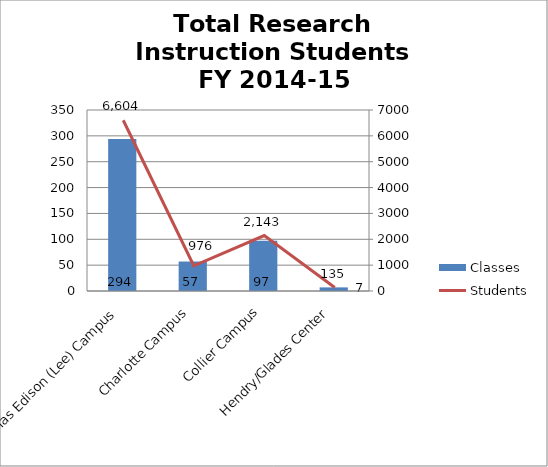
| Category | Classes |
|---|---|
| Thomas Edison (Lee) Campus | 294 |
| Charlotte Campus | 57 |
| Collier Campus | 97 |
| Hendry/Glades Center | 7 |